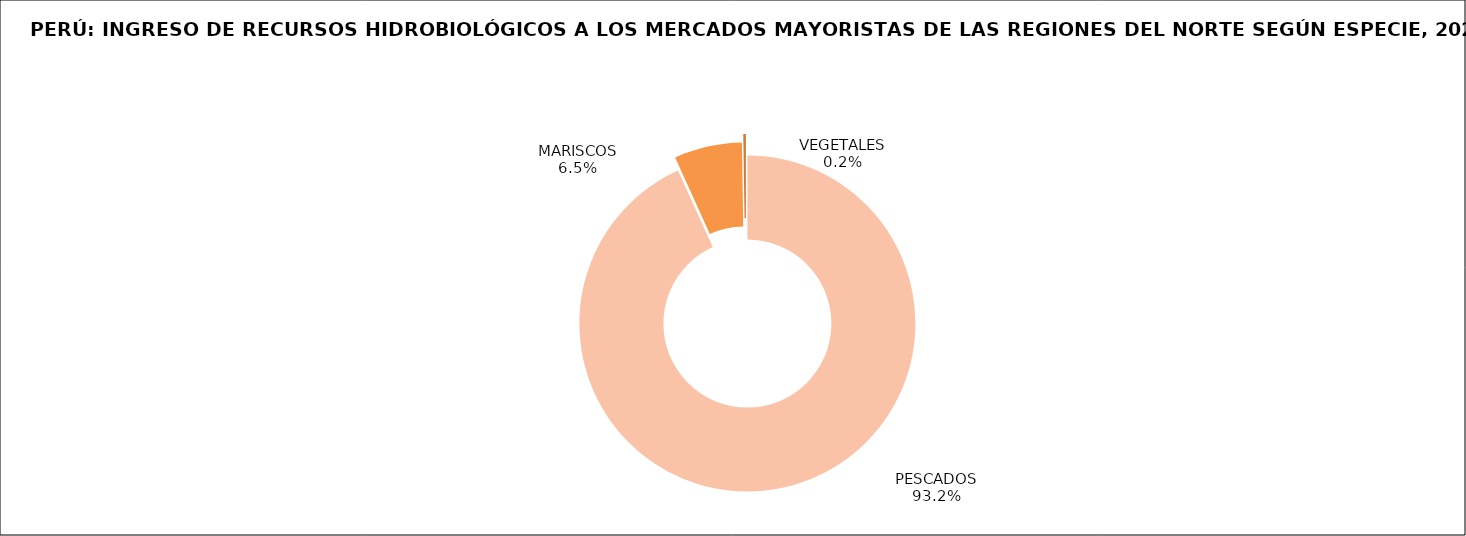
| Category | Series 0 |
|---|---|
| PESCADOS | 109238.412 |
| MARISCOS | 7652.989 |
| VEGETALES | 289.292 |